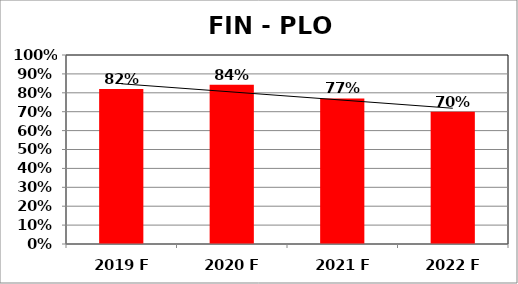
| Category | Series 0 |
|---|---|
| 2019 F | 0.82 |
| 2020 F | 0.842 |
| 2021 F | 0.77 |
| 2022 F | 0.7 |